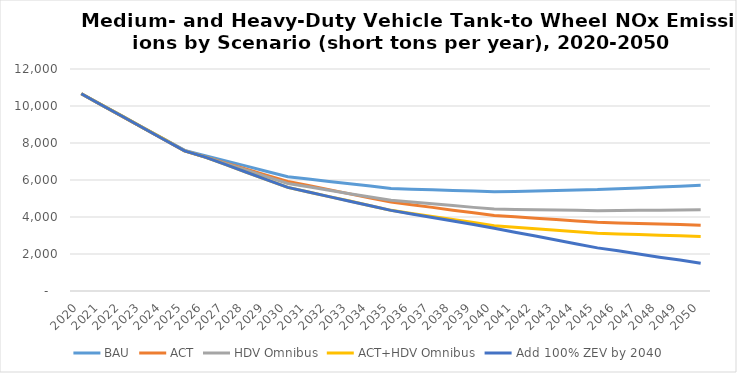
| Category | BAU | ACT | HDV Omnibus | ACT+HDV Omnibus | Add 100% ZEV by 2040 |
|---|---|---|---|---|---|
| 2020.0 | 10660 | 10660 | 10660 | 10660 | 10662.42 |
| 2021.0 | 10050 | 10040 | 10050 | 10050 | 10040 |
| 2022.0 | 9440 | 9420 | 9440 | 9440 | 9430 |
| 2023.0 | 8820 | 8810 | 8820 | 8820 | 8810 |
| 2024.0 | 8210 | 8190 | 8210 | 8210 | 8190 |
| 2025.0 | 7600 | 7570 | 7600 | 7570 | 7572.646 |
| 2026.0 | 7320 | 7240 | 7240 | 7240 | 7240 |
| 2027.0 | 7030 | 6910 | 6880 | 6830 | 6830 |
| 2028.0 | 6750 | 6580 | 6530 | 6420 | 6420 |
| 2029.0 | 6460 | 6250 | 6170 | 6010 | 6010 |
| 2030.0 | 6180 | 5920 | 5810 | 5600 | 5600.325 |
| 2031.0 | 6050 | 5700 | 5630 | 5350 | 5350 |
| 2032.0 | 5920 | 5480 | 5450 | 5100 | 5100 |
| 2033.0 | 5800 | 5250 | 5260 | 4860 | 4850 |
| 2034.0 | 5670 | 5030 | 5080 | 4610 | 4610 |
| 2035.0 | 5540 | 4810 | 4900 | 4360 | 4356.821 |
| 2036.0 | 5500 | 4660 | 4810 | 4190 | 4160 |
| 2037.0 | 5470 | 4520 | 4710 | 4030 | 3970 |
| 2038.0 | 5430 | 4370 | 4620 | 3860 | 3780 |
| 2039.0 | 5400 | 4230 | 4520 | 3700 | 3590 |
| 2040.0 | 5360 | 4080 | 4430 | 3530 | 3393.159 |
| 2041.0 | 5380 | 4010 | 4410 | 3450 | 3180 |
| 2042.0 | 5410 | 3930 | 4390 | 3370 | 2970 |
| 2043.0 | 5430 | 3860 | 4380 | 3280 | 2760 |
| 2044.0 | 5460 | 3780 | 4360 | 3200 | 2540 |
| 2045.0 | 5480 | 3710 | 4340 | 3120 | 2330.685 |
| 2046.0 | 5530 | 3680 | 4350 | 3080 | 2170 |
| 2047.0 | 5570 | 3650 | 4360 | 3050 | 2000 |
| 2048.0 | 5620 | 3620 | 4370 | 3010 | 1830 |
| 2049.0 | 5660 | 3590 | 4380 | 2980 | 1670 |
| 2050.0 | 5710 | 3560 | 4390 | 2940 | 1503.314 |